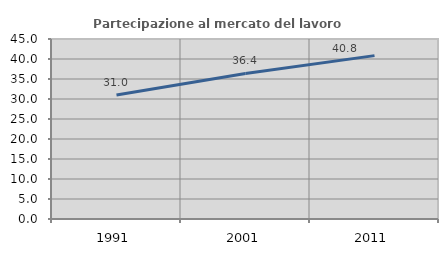
| Category | Partecipazione al mercato del lavoro  femminile |
|---|---|
| 1991.0 | 31.015 |
| 2001.0 | 36.381 |
| 2011.0 | 40.842 |